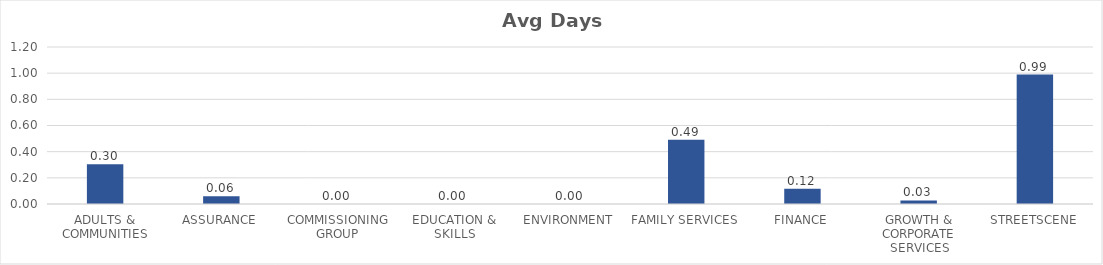
| Category | Avg Days Lost/FTE |
|---|---|
| ADULTS & COMMUNITIES | 0.304 |
| ASSURANCE | 0.06 |
| COMMISSIONING GROUP | 0 |
| EDUCATION & SKILLS | 0 |
| ENVIRONMENT | 0 |
| FAMILY SERVICES | 0.491 |
| FINANCE | 0.117 |
| GROWTH & CORPORATE SERVICES | 0.028 |
| STREETSCENE | 0.989 |